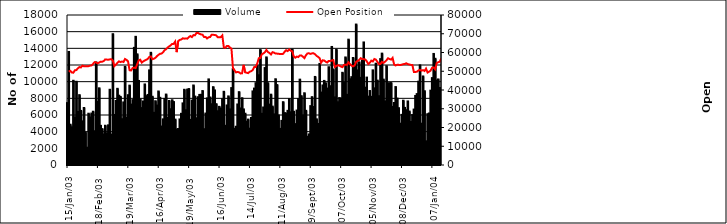
| Category | Volume  |
|---|---|
| 2003-01-15 | 7424 |
| 2003-01-16 | 13565 |
| 2003-01-17 | 4835 |
| 2003-01-20 | 4517 |
| 2003-01-21 | 10104 |
| 2003-01-22 | 5686 |
| 2003-01-23 | 9987 |
| 2003-01-24 | 6372 |
| 2003-01-27 | 8381 |
| 2003-01-28 | 6491 |
| 2003-01-29 | 5235 |
| 2003-01-30 | 6842 |
| 2003-02-05 | 3901 |
| 2003-02-06 | 2075 |
| 2003-02-07 | 6155 |
| 2003-02-10 | 5725 |
| 2003-02-11 | 6176 |
| 2003-02-13 | 6392 |
| 2003-02-14 | 4053 |
| 2003-02-17 | 12310 |
| 2003-02-18 | 7571 |
| 2003-02-19 | 9201 |
| 2003-02-20 | 4699 |
| 2003-02-21 | 4309 |
| 2003-02-24 | 3666 |
| 2003-02-25 | 4710 |
| 2003-02-26 | 3773 |
| 2003-02-27 | 4759 |
| 2003-02-28 | 9027 |
| 2003-03-03 | 3650 |
| 2003-03-05 | 15697 |
| 2003-03-06 | 6006 |
| 2003-03-07 | 7680 |
| 2003-03-10 | 9142 |
| 2003-03-11 | 8316 |
| 2003-03-12 | 8170 |
| 2003-03-13 | 5496 |
| 2003-03-14 | 7509 |
| 2003-03-17 | 11781 |
| 2003-03-18 | 5681 |
| 2003-03-19 | 8377 |
| 2003-03-20 | 9523 |
| 2003-03-21 | 7248 |
| 2003-03-24 | 7789 |
| 2003-03-25 | 14056 |
| 2003-03-26 | 15380 |
| 2003-03-27 | 13278 |
| 2003-03-28 | 10086 |
| 2003-03-31 | 7869 |
| 2003-04-01 | 6830 |
| 2003-04-02 | 7623 |
| 2003-04-03 | 9665 |
| 2003-04-04 | 8262 |
| 2003-04-07 | 8406 |
| 2003-04-08 | 11355 |
| 2003-04-09 | 13463 |
| 2003-04-10 | 8188 |
| 2003-04-11 | 6264 |
| 2003-04-14 | 7650 |
| 2003-04-15 | 7133 |
| 2003-04-16 | 8820 |
| 2003-04-17 | 8063 |
| 2003-04-18 | 4616 |
| 2003-04-21 | 5479 |
| 2003-04-22 | 7926 |
| 2003-04-23 | 8453 |
| 2003-04-24 | 5647 |
| 2003-04-25 | 7678 |
| 2003-04-28 | 6693 |
| 2003-04-29 | 7769 |
| 2003-04-30 | 7554 |
| 2003-05-02 | 5446 |
| 2003-05-05 | 4257 |
| 2003-05-06 | 4316 |
| 2003-05-07 | 5468 |
| 2003-05-08 | 6144 |
| 2003-05-09 | 7392 |
| 2003-05-12 | 9025 |
| 2003-05-13 | 6573 |
| 2003-05-16 | 9045 |
| 2003-05-19 | 9113 |
| 2003-05-20 | 5415 |
| 2003-05-21 | 7725 |
| 2003-05-22 | 9541 |
| 2003-05-23 | 8209 |
| 2003-05-26 | 5607 |
| 2003-05-27 | 8135 |
| 2003-05-28 | 8409 |
| 2003-05-29 | 8421 |
| 2003-05-30 | 8873 |
| 2003-06-02 | 4296 |
| 2003-06-03 | 6174 |
| 2003-06-04 | 7990 |
| 2003-06-05 | 10272 |
| 2003-06-06 | 8098 |
| 2003-06-09 | 7289 |
| 2003-06-10 | 9339 |
| 2003-06-11 | 8947 |
| 2003-06-12 | 7299 |
| 2003-06-13 | 6451 |
| 2003-06-16 | 6978 |
| 2003-06-17 | 6750 |
| 2003-06-18 | 7888 |
| 2003-06-19 | 8783 |
| 2003-06-20 | 4703 |
| 2003-06-23 | 7145 |
| 2003-06-24 | 8230 |
| 2003-06-25 | 6670 |
| 2003-06-26 | 9229 |
| 2003-06-27 | 11493 |
| 2003-06-30 | 4340 |
| 2003-07-01 | 4591 |
| 2003-07-02 | 7263 |
| 2003-07-03 | 8741 |
| 2003-07-04 | 6786 |
| 2003-07-07 | 8013 |
| 2003-07-08 | 6672 |
| 2003-07-09 | 6154 |
| 2003-07-10 | 5187 |
| 2003-07-11 | 5449 |
| 2003-07-14 | 4359 |
| 2003-07-15 | 5639 |
| 2003-07-16 | 8830 |
| 2003-07-17 | 9169 |
| 2003-07-18 | 9819 |
| 2003-07-21 | 11929 |
| 2003-07-22 | 10769 |
| 2003-07-23 | 13789 |
| 2003-07-24 | 6145 |
| 2003-07-25 | 6899 |
| 2003-07-28 | 11632 |
| 2003-07-29 | 12908 |
| 2003-07-30 | 9810 |
| 2003-07-31 | 7246 |
| 2003-08-01 | 8438 |
| 2003-08-04 | 7005 |
| 2003-08-05 | 6077 |
| 2003-08-06 | 10290 |
| 2003-08-07 | 9593 |
| 2003-08-08 | 5942 |
| 2003-08-11 | 4336 |
| 2003-08-12 | 5295 |
| 2003-08-13 | 7538 |
| 2003-08-14 | 6223 |
| 2003-08-15 | 6176 |
| 2003-08-18 | 6498 |
| 2003-08-19 | 7913 |
| 2003-08-20 | 6327 |
| 2003-08-21 | 13852 |
| 2003-08-22 | 6384 |
| 2003-08-25 | 4907 |
| 2003-08-26 | 6534 |
| 2003-08-27 | 7918 |
| 2003-08-28 | 10242 |
| 2003-08-29 | 8260 |
| 2003-09-02 | 5938 |
| 2003-09-03 | 8608 |
| 2003-09-04 | 6502 |
| 2003-09-05 | 3391 |
| 2003-09-08 | 3673 |
| 2003-09-09 | 7062 |
| 2003-09-10 | 8140 |
| 2003-09-11 | 6962 |
| 2003-09-12 | 10568 |
| 2003-09-15 | 5481 |
| 2003-09-16 | 4924 |
| 2003-09-17 | 12131 |
| 2003-09-18 | 8692 |
| 2003-09-19 | 9547 |
| 2003-09-22 | 10090 |
| 2003-09-23 | 9798 |
| 2003-09-24 | 9170 |
| 2003-09-25 | 11732 |
| 2003-09-26 | 9456 |
| 2003-09-29 | 14165 |
| 2003-09-30 | 11464 |
| 2003-10-01 | 8113 |
| 2003-10-02 | 13825 |
| 2003-10-03 | 7529 |
| 2003-10-06 | 8031 |
| 2003-10-07 | 7968 |
| 2003-10-08 | 11064 |
| 2003-10-09 | 9836 |
| 2003-10-10 | 12905 |
| 2003-10-13 | 8421 |
| 2003-10-14 | 15040 |
| 2003-10-15 | 10287 |
| 2003-10-16 | 10539 |
| 2003-10-17 | 12841 |
| 2003-10-20 | 12170 |
| 2003-10-21 | 16854 |
| 2003-10-22 | 11350 |
| 2003-10-23 | 12318 |
| 2003-10-27 | 10457 |
| 2003-10-28 | 12532 |
| 2003-10-29 | 14706 |
| 2003-10-30 | 9279 |
| 2003-10-31 | 10489 |
| 2003-11-03 | 8204 |
| 2003-11-04 | 8876 |
| 2003-11-05 | 8177 |
| 2003-11-06 | 11357 |
| 2003-11-07 | 9200 |
| 2003-11-10 | 12157 |
| 2003-11-11 | 10126 |
| 2003-11-12 | 8256 |
| 2003-11-13 | 12706 |
| 2003-11-14 | 13365 |
| 2003-11-17 | 10243 |
| 2003-11-18 | 7632 |
| 2003-11-19 | 11851 |
| 2003-11-20 | 9796 |
| 2003-11-21 | 9818 |
| 2003-11-27 | 9830 |
| 2003-11-28 | 6973 |
| 2003-12-01 | 7443 |
| 2003-12-02 | 9351 |
| 2003-12-03 | 7968 |
| 2003-12-04 | 6818 |
| 2003-12-05 | 4957 |
| 2003-12-08 | 6018 |
| 2003-12-09 | 7718 |
| 2003-12-10 | 6852 |
| 2003-12-11 | 6576 |
| 2003-12-12 | 7628 |
| 2003-12-15 | 6411 |
| 2003-12-16 | 5162 |
| 2003-12-17 | 5995 |
| 2003-12-18 | 6653 |
| 2003-12-19 | 8285 |
| 2003-12-22 | 8508 |
| 2003-12-23 | 9998 |
| 2003-12-24 | 11957 |
| 2003-12-26 | 4958 |
| 2003-12-29 | 10625 |
| 2003-12-30 | 8853 |
| 2003-12-31 | 2839 |
| 2004-01-02 | 6097 |
| 2004-01-05 | 6182 |
| 2004-01-06 | 8920 |
| 2004-01-07 | 10427 |
| 2004-01-08 | 13327 |
| 2004-01-09 | 12746 |
| 2004-01-12 | 10133 |
| 2004-01-13 | 10268 |
| 2004-01-14 | 9239 |